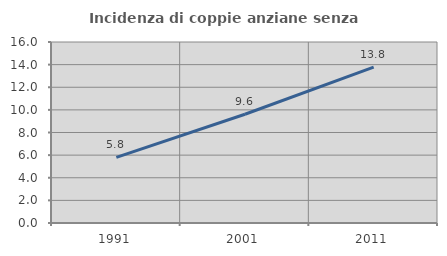
| Category | Incidenza di coppie anziane senza figli  |
|---|---|
| 1991.0 | 5.797 |
| 2001.0 | 9.612 |
| 2011.0 | 13.778 |